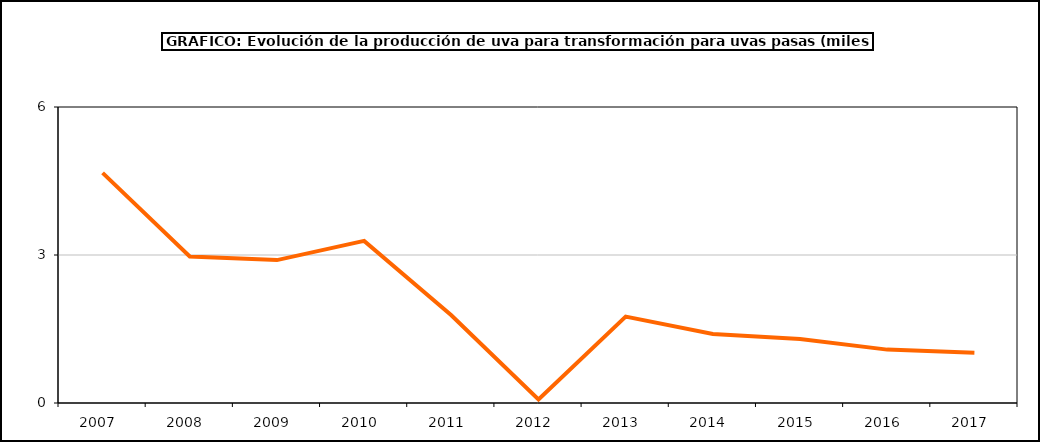
| Category | producción |
|---|---|
| 2007.0 | 4.664 |
| 2008.0 | 2.971 |
| 2009.0 | 2.897 |
| 2010.0 | 3.286 |
| 2011.0 | 1.779 |
| 2012.0 | 0.072 |
| 2013.0 | 1.751 |
| 2014.0 | 1.399 |
| 2015.0 | 1.295 |
| 2016.0 | 1.082 |
| 2017.0 | 1.02 |